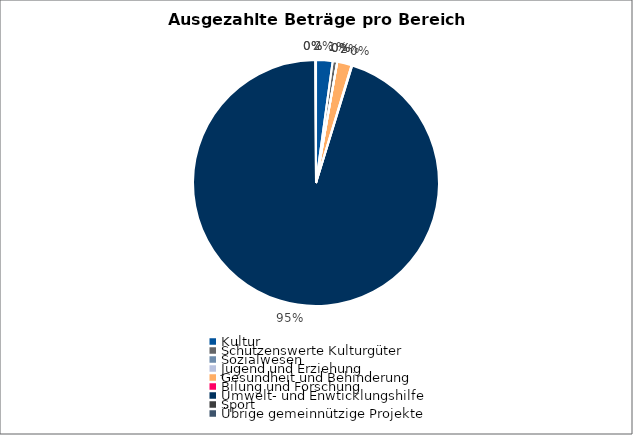
| Category | Series 0 |
|---|---|
| Kultur | 40000 |
| Schützenswerte Kulturgüter | 11000 |
| Sozialwesen | 0 |
| Jugend und Erziehung | 0 |
| Gesundheit und Behinderung | 35000 |
| Bilung und Forschung | 1632.4 |
| Umwelt- und Enwticklungshilfe | 1754563.47 |
| Sport | 0 |
| Übrige gemeinnützige Projekte | 1500 |